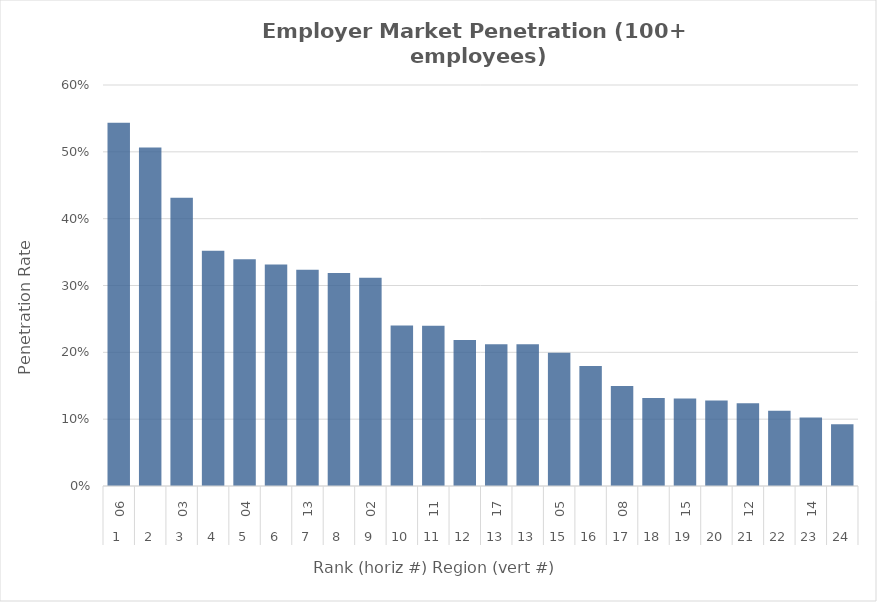
| Category | Rate |
|---|---|
| 0 | 0.543 |
| 1 | 0.506 |
| 2 | 0.431 |
| 3 | 0.352 |
| 4 | 0.339 |
| 5 | 0.331 |
| 6 | 0.323 |
| 7 | 0.319 |
| 8 | 0.312 |
| 9 | 0.24 |
| 10 | 0.24 |
| 11 | 0.218 |
| 12 | 0.212 |
| 13 | 0.212 |
| 14 | 0.199 |
| 15 | 0.179 |
| 16 | 0.149 |
| 17 | 0.132 |
| 18 | 0.131 |
| 19 | 0.128 |
| 20 | 0.124 |
| 21 | 0.113 |
| 22 | 0.103 |
| 23 | 0.092 |